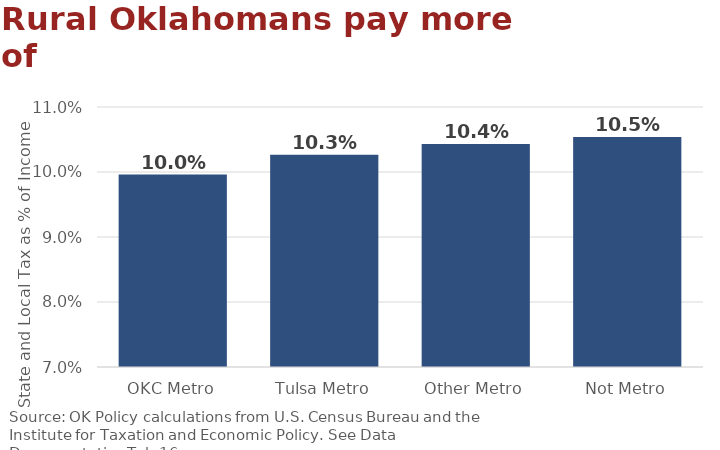
| Category | Series 0 |
|---|---|
| OKC Metro | 0.1 |
| Tulsa Metro | 0.103 |
| Other Metro | 0.104 |
| Not Metro | 0.105 |